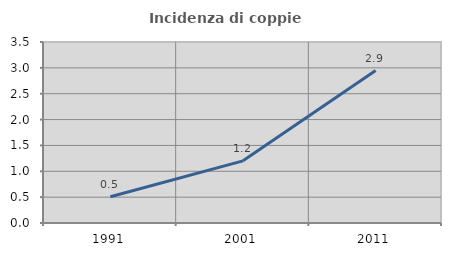
| Category | Incidenza di coppie miste |
|---|---|
| 1991.0 | 0.508 |
| 2001.0 | 1.202 |
| 2011.0 | 2.947 |